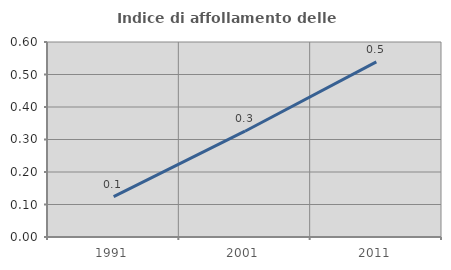
| Category | Indice di affollamento delle abitazioni  |
|---|---|
| 1991.0 | 0.124 |
| 2001.0 | 0.325 |
| 2011.0 | 0.539 |